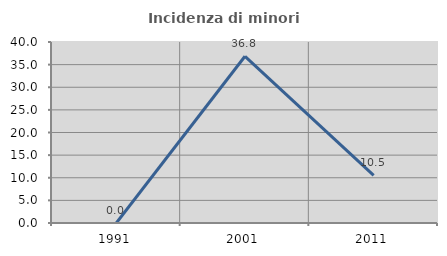
| Category | Incidenza di minori stranieri |
|---|---|
| 1991.0 | 0 |
| 2001.0 | 36.842 |
| 2011.0 | 10.526 |